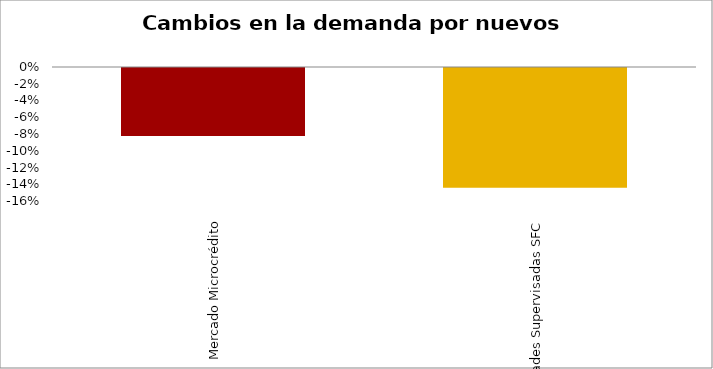
| Category | Microcrédito |
|---|---|
| Mercado Microcrédito | -0.081 |
| Entidades Supervisadas SFC | -0.143 |